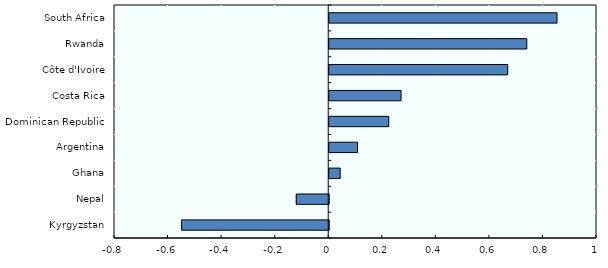
| Category | Immigrant contribution (% GDP, marginal) |
|---|---|
| Kyrgyzstan | -0.549 |
| Nepal | -0.121 |
| Ghana | 0.041 |
| Argentina | 0.106 |
| Dominican Republic | 0.222 |
| Costa Rica | 0.268 |
| Côte d'Ivoire | 0.667 |
| Rwanda | 0.738 |
| South Africa | 0.851 |